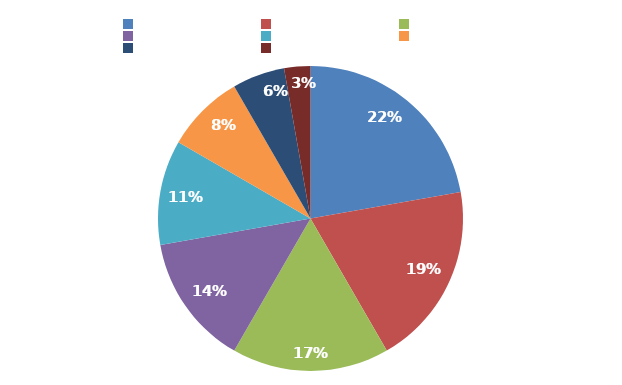
| Category | Series 0 |
|---|---|
| Aceitável | 8 |
| Muito baixo | 7 |
| Baixo | 6 |
| Significante | 5 |
| Alto | 4 |
| Muito Alto | 3 |
| Extremo | 2 |
| Inaceitável | 1 |